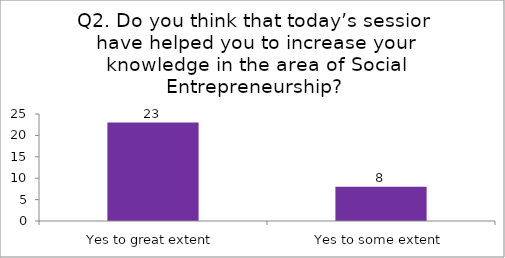
| Category | Q2. Do you think that today’s session have helped you to increase your knowledge in the area of Social Entrepreneurship? |
|---|---|
| Yes to great extent | 23 |
| Yes to some extent | 8 |